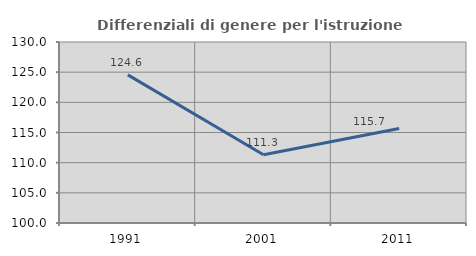
| Category | Differenziali di genere per l'istruzione superiore |
|---|---|
| 1991.0 | 124.553 |
| 2001.0 | 111.323 |
| 2011.0 | 115.656 |